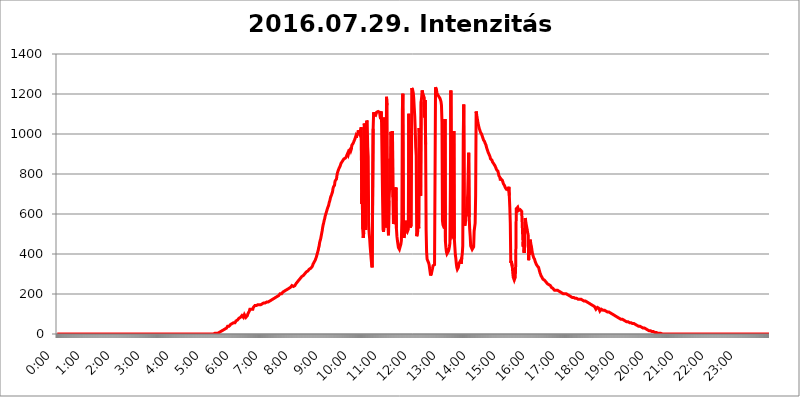
| Category | 2016.07.29. Intenzitás [W/m^2] |
|---|---|
| 0.0 | 0 |
| 0.0006944444444444445 | 0 |
| 0.001388888888888889 | 0 |
| 0.0020833333333333333 | 0 |
| 0.002777777777777778 | 0 |
| 0.003472222222222222 | 0 |
| 0.004166666666666667 | 0 |
| 0.004861111111111111 | 0 |
| 0.005555555555555556 | 0 |
| 0.0062499999999999995 | 0 |
| 0.006944444444444444 | 0 |
| 0.007638888888888889 | 0 |
| 0.008333333333333333 | 0 |
| 0.009027777777777779 | 0 |
| 0.009722222222222222 | 0 |
| 0.010416666666666666 | 0 |
| 0.011111111111111112 | 0 |
| 0.011805555555555555 | 0 |
| 0.012499999999999999 | 0 |
| 0.013194444444444444 | 0 |
| 0.013888888888888888 | 0 |
| 0.014583333333333332 | 0 |
| 0.015277777777777777 | 0 |
| 0.015972222222222224 | 0 |
| 0.016666666666666666 | 0 |
| 0.017361111111111112 | 0 |
| 0.018055555555555557 | 0 |
| 0.01875 | 0 |
| 0.019444444444444445 | 0 |
| 0.02013888888888889 | 0 |
| 0.020833333333333332 | 0 |
| 0.02152777777777778 | 0 |
| 0.022222222222222223 | 0 |
| 0.02291666666666667 | 0 |
| 0.02361111111111111 | 0 |
| 0.024305555555555556 | 0 |
| 0.024999999999999998 | 0 |
| 0.025694444444444447 | 0 |
| 0.02638888888888889 | 0 |
| 0.027083333333333334 | 0 |
| 0.027777777777777776 | 0 |
| 0.02847222222222222 | 0 |
| 0.029166666666666664 | 0 |
| 0.029861111111111113 | 0 |
| 0.030555555555555555 | 0 |
| 0.03125 | 0 |
| 0.03194444444444445 | 0 |
| 0.03263888888888889 | 0 |
| 0.03333333333333333 | 0 |
| 0.034027777777777775 | 0 |
| 0.034722222222222224 | 0 |
| 0.035416666666666666 | 0 |
| 0.036111111111111115 | 0 |
| 0.03680555555555556 | 0 |
| 0.0375 | 0 |
| 0.03819444444444444 | 0 |
| 0.03888888888888889 | 0 |
| 0.03958333333333333 | 0 |
| 0.04027777777777778 | 0 |
| 0.04097222222222222 | 0 |
| 0.041666666666666664 | 0 |
| 0.042361111111111106 | 0 |
| 0.04305555555555556 | 0 |
| 0.043750000000000004 | 0 |
| 0.044444444444444446 | 0 |
| 0.04513888888888889 | 0 |
| 0.04583333333333334 | 0 |
| 0.04652777777777778 | 0 |
| 0.04722222222222222 | 0 |
| 0.04791666666666666 | 0 |
| 0.04861111111111111 | 0 |
| 0.049305555555555554 | 0 |
| 0.049999999999999996 | 0 |
| 0.05069444444444445 | 0 |
| 0.051388888888888894 | 0 |
| 0.052083333333333336 | 0 |
| 0.05277777777777778 | 0 |
| 0.05347222222222222 | 0 |
| 0.05416666666666667 | 0 |
| 0.05486111111111111 | 0 |
| 0.05555555555555555 | 0 |
| 0.05625 | 0 |
| 0.05694444444444444 | 0 |
| 0.057638888888888885 | 0 |
| 0.05833333333333333 | 0 |
| 0.05902777777777778 | 0 |
| 0.059722222222222225 | 0 |
| 0.06041666666666667 | 0 |
| 0.061111111111111116 | 0 |
| 0.06180555555555556 | 0 |
| 0.0625 | 0 |
| 0.06319444444444444 | 0 |
| 0.06388888888888888 | 0 |
| 0.06458333333333334 | 0 |
| 0.06527777777777778 | 0 |
| 0.06597222222222222 | 0 |
| 0.06666666666666667 | 0 |
| 0.06736111111111111 | 0 |
| 0.06805555555555555 | 0 |
| 0.06874999999999999 | 0 |
| 0.06944444444444443 | 0 |
| 0.07013888888888889 | 0 |
| 0.07083333333333333 | 0 |
| 0.07152777777777779 | 0 |
| 0.07222222222222223 | 0 |
| 0.07291666666666667 | 0 |
| 0.07361111111111111 | 0 |
| 0.07430555555555556 | 0 |
| 0.075 | 0 |
| 0.07569444444444444 | 0 |
| 0.0763888888888889 | 0 |
| 0.07708333333333334 | 0 |
| 0.07777777777777778 | 0 |
| 0.07847222222222222 | 0 |
| 0.07916666666666666 | 0 |
| 0.0798611111111111 | 0 |
| 0.08055555555555556 | 0 |
| 0.08125 | 0 |
| 0.08194444444444444 | 0 |
| 0.08263888888888889 | 0 |
| 0.08333333333333333 | 0 |
| 0.08402777777777777 | 0 |
| 0.08472222222222221 | 0 |
| 0.08541666666666665 | 0 |
| 0.08611111111111112 | 0 |
| 0.08680555555555557 | 0 |
| 0.08750000000000001 | 0 |
| 0.08819444444444445 | 0 |
| 0.08888888888888889 | 0 |
| 0.08958333333333333 | 0 |
| 0.09027777777777778 | 0 |
| 0.09097222222222222 | 0 |
| 0.09166666666666667 | 0 |
| 0.09236111111111112 | 0 |
| 0.09305555555555556 | 0 |
| 0.09375 | 0 |
| 0.09444444444444444 | 0 |
| 0.09513888888888888 | 0 |
| 0.09583333333333333 | 0 |
| 0.09652777777777777 | 0 |
| 0.09722222222222222 | 0 |
| 0.09791666666666667 | 0 |
| 0.09861111111111111 | 0 |
| 0.09930555555555555 | 0 |
| 0.09999999999999999 | 0 |
| 0.10069444444444443 | 0 |
| 0.1013888888888889 | 0 |
| 0.10208333333333335 | 0 |
| 0.10277777777777779 | 0 |
| 0.10347222222222223 | 0 |
| 0.10416666666666667 | 0 |
| 0.10486111111111111 | 0 |
| 0.10555555555555556 | 0 |
| 0.10625 | 0 |
| 0.10694444444444444 | 0 |
| 0.1076388888888889 | 0 |
| 0.10833333333333334 | 0 |
| 0.10902777777777778 | 0 |
| 0.10972222222222222 | 0 |
| 0.1111111111111111 | 0 |
| 0.11180555555555556 | 0 |
| 0.11180555555555556 | 0 |
| 0.1125 | 0 |
| 0.11319444444444444 | 0 |
| 0.11388888888888889 | 0 |
| 0.11458333333333333 | 0 |
| 0.11527777777777777 | 0 |
| 0.11597222222222221 | 0 |
| 0.11666666666666665 | 0 |
| 0.1173611111111111 | 0 |
| 0.11805555555555557 | 0 |
| 0.11944444444444445 | 0 |
| 0.12013888888888889 | 0 |
| 0.12083333333333333 | 0 |
| 0.12152777777777778 | 0 |
| 0.12222222222222223 | 0 |
| 0.12291666666666667 | 0 |
| 0.12291666666666667 | 0 |
| 0.12361111111111112 | 0 |
| 0.12430555555555556 | 0 |
| 0.125 | 0 |
| 0.12569444444444444 | 0 |
| 0.12638888888888888 | 0 |
| 0.12708333333333333 | 0 |
| 0.16875 | 0 |
| 0.12847222222222224 | 0 |
| 0.12916666666666668 | 0 |
| 0.12986111111111112 | 0 |
| 0.13055555555555556 | 0 |
| 0.13125 | 0 |
| 0.13194444444444445 | 0 |
| 0.1326388888888889 | 0 |
| 0.13333333333333333 | 0 |
| 0.13402777777777777 | 0 |
| 0.13402777777777777 | 0 |
| 0.13472222222222222 | 0 |
| 0.13541666666666666 | 0 |
| 0.1361111111111111 | 0 |
| 0.13749999999999998 | 0 |
| 0.13819444444444443 | 0 |
| 0.1388888888888889 | 0 |
| 0.13958333333333334 | 0 |
| 0.14027777777777778 | 0 |
| 0.14097222222222222 | 0 |
| 0.14166666666666666 | 0 |
| 0.1423611111111111 | 0 |
| 0.14305555555555557 | 0 |
| 0.14375000000000002 | 0 |
| 0.14444444444444446 | 0 |
| 0.1451388888888889 | 0 |
| 0.1451388888888889 | 0 |
| 0.14652777777777778 | 0 |
| 0.14722222222222223 | 0 |
| 0.14791666666666667 | 0 |
| 0.1486111111111111 | 0 |
| 0.14930555555555555 | 0 |
| 0.15 | 0 |
| 0.15069444444444444 | 0 |
| 0.15138888888888888 | 0 |
| 0.15208333333333332 | 0 |
| 0.15277777777777776 | 0 |
| 0.15347222222222223 | 0 |
| 0.15416666666666667 | 0 |
| 0.15486111111111112 | 0 |
| 0.15555555555555556 | 0 |
| 0.15625 | 0 |
| 0.15694444444444444 | 0 |
| 0.15763888888888888 | 0 |
| 0.15833333333333333 | 0 |
| 0.15902777777777777 | 0 |
| 0.15972222222222224 | 0 |
| 0.16041666666666668 | 0 |
| 0.16111111111111112 | 0 |
| 0.16180555555555556 | 0 |
| 0.1625 | 0 |
| 0.16319444444444445 | 0 |
| 0.1638888888888889 | 0 |
| 0.16458333333333333 | 0 |
| 0.16527777777777777 | 0 |
| 0.16597222222222222 | 0 |
| 0.16666666666666666 | 0 |
| 0.1673611111111111 | 0 |
| 0.16805555555555554 | 0 |
| 0.16874999999999998 | 0 |
| 0.16944444444444443 | 0 |
| 0.17013888888888887 | 0 |
| 0.1708333333333333 | 0 |
| 0.17152777777777775 | 0 |
| 0.17222222222222225 | 0 |
| 0.1729166666666667 | 0 |
| 0.17361111111111113 | 0 |
| 0.17430555555555557 | 0 |
| 0.17500000000000002 | 0 |
| 0.17569444444444446 | 0 |
| 0.1763888888888889 | 0 |
| 0.17708333333333334 | 0 |
| 0.17777777777777778 | 0 |
| 0.17847222222222223 | 0 |
| 0.17916666666666667 | 0 |
| 0.1798611111111111 | 0 |
| 0.18055555555555555 | 0 |
| 0.18125 | 0 |
| 0.18194444444444444 | 0 |
| 0.1826388888888889 | 0 |
| 0.18333333333333335 | 0 |
| 0.1840277777777778 | 0 |
| 0.18472222222222223 | 0 |
| 0.18541666666666667 | 0 |
| 0.18611111111111112 | 0 |
| 0.18680555555555556 | 0 |
| 0.1875 | 0 |
| 0.18819444444444444 | 0 |
| 0.18888888888888888 | 0 |
| 0.18958333333333333 | 0 |
| 0.19027777777777777 | 0 |
| 0.1909722222222222 | 0 |
| 0.19166666666666665 | 0 |
| 0.19236111111111112 | 0 |
| 0.19305555555555554 | 0 |
| 0.19375 | 0 |
| 0.19444444444444445 | 0 |
| 0.1951388888888889 | 0 |
| 0.19583333333333333 | 0 |
| 0.19652777777777777 | 0 |
| 0.19722222222222222 | 0 |
| 0.19791666666666666 | 0 |
| 0.1986111111111111 | 0 |
| 0.19930555555555554 | 0 |
| 0.19999999999999998 | 0 |
| 0.20069444444444443 | 0 |
| 0.20138888888888887 | 0 |
| 0.2020833333333333 | 0 |
| 0.2027777777777778 | 0 |
| 0.2034722222222222 | 0 |
| 0.2041666666666667 | 0 |
| 0.20486111111111113 | 0 |
| 0.20555555555555557 | 0 |
| 0.20625000000000002 | 0 |
| 0.20694444444444446 | 0 |
| 0.2076388888888889 | 0 |
| 0.20833333333333334 | 0 |
| 0.20902777777777778 | 0 |
| 0.20972222222222223 | 0 |
| 0.21041666666666667 | 0 |
| 0.2111111111111111 | 0 |
| 0.21180555555555555 | 0 |
| 0.2125 | 0 |
| 0.21319444444444444 | 0 |
| 0.2138888888888889 | 0 |
| 0.21458333333333335 | 0 |
| 0.2152777777777778 | 0 |
| 0.21597222222222223 | 0 |
| 0.21666666666666667 | 0 |
| 0.21736111111111112 | 0 |
| 0.21805555555555556 | 0 |
| 0.21875 | 0 |
| 0.21944444444444444 | 0 |
| 0.22013888888888888 | 3.525 |
| 0.22083333333333333 | 3.525 |
| 0.22152777777777777 | 3.525 |
| 0.2222222222222222 | 3.525 |
| 0.22291666666666665 | 3.525 |
| 0.2236111111111111 | 3.525 |
| 0.22430555555555556 | 3.525 |
| 0.225 | 3.525 |
| 0.22569444444444445 | 3.525 |
| 0.2263888888888889 | 7.887 |
| 0.22708333333333333 | 7.887 |
| 0.22777777777777777 | 7.887 |
| 0.22847222222222222 | 7.887 |
| 0.22916666666666666 | 12.257 |
| 0.2298611111111111 | 12.257 |
| 0.23055555555555554 | 12.257 |
| 0.23124999999999998 | 16.636 |
| 0.23194444444444443 | 16.636 |
| 0.23263888888888887 | 21.024 |
| 0.2333333333333333 | 21.024 |
| 0.2340277777777778 | 25.419 |
| 0.2347222222222222 | 25.419 |
| 0.2354166666666667 | 25.419 |
| 0.23611111111111113 | 29.823 |
| 0.23680555555555557 | 29.823 |
| 0.23750000000000002 | 29.823 |
| 0.23819444444444446 | 34.234 |
| 0.2388888888888889 | 38.653 |
| 0.23958333333333334 | 38.653 |
| 0.24027777777777778 | 38.653 |
| 0.24097222222222223 | 38.653 |
| 0.24166666666666667 | 43.079 |
| 0.2423611111111111 | 43.079 |
| 0.24305555555555555 | 47.511 |
| 0.24375 | 47.511 |
| 0.24444444444444446 | 47.511 |
| 0.24513888888888888 | 51.951 |
| 0.24583333333333335 | 51.951 |
| 0.2465277777777778 | 51.951 |
| 0.24722222222222223 | 56.398 |
| 0.24791666666666667 | 56.398 |
| 0.24861111111111112 | 56.398 |
| 0.24930555555555556 | 56.398 |
| 0.25 | 60.85 |
| 0.25069444444444444 | 65.31 |
| 0.2513888888888889 | 65.31 |
| 0.2520833333333333 | 65.31 |
| 0.25277777777777777 | 69.775 |
| 0.2534722222222222 | 74.246 |
| 0.25416666666666665 | 74.246 |
| 0.2548611111111111 | 78.722 |
| 0.2555555555555556 | 78.722 |
| 0.25625000000000003 | 83.205 |
| 0.2569444444444445 | 83.205 |
| 0.2576388888888889 | 87.692 |
| 0.25833333333333336 | 87.692 |
| 0.2590277777777778 | 92.184 |
| 0.25972222222222224 | 92.184 |
| 0.2604166666666667 | 92.184 |
| 0.2611111111111111 | 83.205 |
| 0.26180555555555557 | 87.692 |
| 0.2625 | 96.682 |
| 0.26319444444444445 | 96.682 |
| 0.2638888888888889 | 92.184 |
| 0.26458333333333334 | 83.205 |
| 0.2652777777777778 | 78.722 |
| 0.2659722222222222 | 87.692 |
| 0.26666666666666666 | 92.184 |
| 0.2673611111111111 | 101.184 |
| 0.26805555555555555 | 105.69 |
| 0.26875 | 105.69 |
| 0.26944444444444443 | 114.716 |
| 0.2701388888888889 | 123.758 |
| 0.2708333333333333 | 123.758 |
| 0.27152777777777776 | 128.284 |
| 0.2722222222222222 | 123.758 |
| 0.27291666666666664 | 123.758 |
| 0.2736111111111111 | 123.758 |
| 0.2743055555555555 | 123.758 |
| 0.27499999999999997 | 132.814 |
| 0.27569444444444446 | 137.347 |
| 0.27638888888888885 | 137.347 |
| 0.27708333333333335 | 141.884 |
| 0.2777777777777778 | 141.884 |
| 0.27847222222222223 | 141.884 |
| 0.2791666666666667 | 141.884 |
| 0.2798611111111111 | 141.884 |
| 0.28055555555555556 | 146.423 |
| 0.28125 | 146.423 |
| 0.28194444444444444 | 146.423 |
| 0.2826388888888889 | 146.423 |
| 0.2833333333333333 | 146.423 |
| 0.28402777777777777 | 146.423 |
| 0.2847222222222222 | 146.423 |
| 0.28541666666666665 | 146.423 |
| 0.28611111111111115 | 146.423 |
| 0.28680555555555554 | 146.423 |
| 0.28750000000000003 | 150.964 |
| 0.2881944444444445 | 150.964 |
| 0.2888888888888889 | 150.964 |
| 0.28958333333333336 | 155.509 |
| 0.2902777777777778 | 155.509 |
| 0.29097222222222224 | 155.509 |
| 0.2916666666666667 | 155.509 |
| 0.2923611111111111 | 155.509 |
| 0.29305555555555557 | 155.509 |
| 0.29375 | 160.056 |
| 0.29444444444444445 | 160.056 |
| 0.2951388888888889 | 160.056 |
| 0.29583333333333334 | 160.056 |
| 0.2965277777777778 | 164.605 |
| 0.2972222222222222 | 164.605 |
| 0.29791666666666666 | 164.605 |
| 0.2986111111111111 | 169.156 |
| 0.29930555555555555 | 169.156 |
| 0.3 | 169.156 |
| 0.30069444444444443 | 169.156 |
| 0.3013888888888889 | 173.709 |
| 0.3020833333333333 | 173.709 |
| 0.30277777777777776 | 173.709 |
| 0.3034722222222222 | 178.264 |
| 0.30416666666666664 | 178.264 |
| 0.3048611111111111 | 178.264 |
| 0.3055555555555555 | 182.82 |
| 0.30624999999999997 | 182.82 |
| 0.3069444444444444 | 182.82 |
| 0.3076388888888889 | 182.82 |
| 0.30833333333333335 | 187.378 |
| 0.3090277777777778 | 191.937 |
| 0.30972222222222223 | 191.937 |
| 0.3104166666666667 | 191.937 |
| 0.3111111111111111 | 196.497 |
| 0.31180555555555556 | 196.497 |
| 0.3125 | 201.058 |
| 0.31319444444444444 | 201.058 |
| 0.3138888888888889 | 201.058 |
| 0.3145833333333333 | 201.058 |
| 0.31527777777777777 | 205.62 |
| 0.3159722222222222 | 205.62 |
| 0.31666666666666665 | 210.182 |
| 0.31736111111111115 | 210.182 |
| 0.31805555555555554 | 210.182 |
| 0.31875000000000003 | 214.746 |
| 0.3194444444444445 | 214.746 |
| 0.3201388888888889 | 219.309 |
| 0.32083333333333336 | 219.309 |
| 0.3215277777777778 | 219.309 |
| 0.32222222222222224 | 219.309 |
| 0.3229166666666667 | 223.873 |
| 0.3236111111111111 | 223.873 |
| 0.32430555555555557 | 228.436 |
| 0.325 | 228.436 |
| 0.32569444444444445 | 228.436 |
| 0.3263888888888889 | 233 |
| 0.32708333333333334 | 233 |
| 0.3277777777777778 | 237.564 |
| 0.3284722222222222 | 237.564 |
| 0.32916666666666666 | 242.127 |
| 0.3298611111111111 | 242.127 |
| 0.33055555555555555 | 242.127 |
| 0.33125 | 237.564 |
| 0.33194444444444443 | 242.127 |
| 0.3326388888888889 | 242.127 |
| 0.3333333333333333 | 242.127 |
| 0.3340277777777778 | 246.689 |
| 0.3347222222222222 | 251.251 |
| 0.3354166666666667 | 255.813 |
| 0.3361111111111111 | 255.813 |
| 0.3368055555555556 | 260.373 |
| 0.33749999999999997 | 260.373 |
| 0.33819444444444446 | 264.932 |
| 0.33888888888888885 | 269.49 |
| 0.33958333333333335 | 269.49 |
| 0.34027777777777773 | 274.047 |
| 0.34097222222222223 | 278.603 |
| 0.3416666666666666 | 278.603 |
| 0.3423611111111111 | 283.156 |
| 0.3430555555555555 | 287.709 |
| 0.34375 | 287.709 |
| 0.3444444444444445 | 287.709 |
| 0.3451388888888889 | 292.259 |
| 0.3458333333333334 | 296.808 |
| 0.34652777777777777 | 296.808 |
| 0.34722222222222227 | 301.354 |
| 0.34791666666666665 | 305.898 |
| 0.34861111111111115 | 305.898 |
| 0.34930555555555554 | 310.44 |
| 0.35000000000000003 | 310.44 |
| 0.3506944444444444 | 314.98 |
| 0.3513888888888889 | 314.98 |
| 0.3520833333333333 | 319.517 |
| 0.3527777777777778 | 319.517 |
| 0.3534722222222222 | 324.052 |
| 0.3541666666666667 | 324.052 |
| 0.3548611111111111 | 324.052 |
| 0.35555555555555557 | 328.584 |
| 0.35625 | 333.113 |
| 0.35694444444444445 | 333.113 |
| 0.3576388888888889 | 337.639 |
| 0.35833333333333334 | 342.162 |
| 0.3590277777777778 | 351.198 |
| 0.3597222222222222 | 355.712 |
| 0.36041666666666666 | 360.221 |
| 0.3611111111111111 | 364.728 |
| 0.36180555555555555 | 369.23 |
| 0.3625 | 373.729 |
| 0.36319444444444443 | 382.715 |
| 0.3638888888888889 | 387.202 |
| 0.3645833333333333 | 400.638 |
| 0.3652777777777778 | 409.574 |
| 0.3659722222222222 | 418.492 |
| 0.3666666666666667 | 431.833 |
| 0.3673611111111111 | 440.702 |
| 0.3680555555555556 | 458.38 |
| 0.36874999999999997 | 467.187 |
| 0.36944444444444446 | 475.972 |
| 0.37013888888888885 | 489.108 |
| 0.37083333333333335 | 502.192 |
| 0.37152777777777773 | 515.223 |
| 0.37222222222222223 | 532.513 |
| 0.3729166666666666 | 545.416 |
| 0.3736111111111111 | 553.986 |
| 0.3743055555555555 | 566.793 |
| 0.375 | 575.299 |
| 0.3756944444444445 | 588.009 |
| 0.3763888888888889 | 596.45 |
| 0.3770833333333334 | 604.864 |
| 0.37777777777777777 | 613.252 |
| 0.37847222222222227 | 621.613 |
| 0.37916666666666665 | 629.948 |
| 0.37986111111111115 | 634.105 |
| 0.38055555555555554 | 642.4 |
| 0.38125000000000003 | 654.791 |
| 0.3819444444444444 | 663.019 |
| 0.3826388888888889 | 671.22 |
| 0.3833333333333333 | 683.473 |
| 0.3840277777777778 | 687.544 |
| 0.3847222222222222 | 695.666 |
| 0.3854166666666667 | 703.762 |
| 0.3861111111111111 | 711.832 |
| 0.38680555555555557 | 727.896 |
| 0.3875 | 735.89 |
| 0.38819444444444445 | 739.877 |
| 0.3888888888888889 | 743.859 |
| 0.38958333333333334 | 763.674 |
| 0.3902777777777778 | 759.723 |
| 0.3909722222222222 | 759.723 |
| 0.39166666666666666 | 775.492 |
| 0.3923611111111111 | 795.074 |
| 0.39305555555555555 | 806.757 |
| 0.39375 | 814.519 |
| 0.39444444444444443 | 822.26 |
| 0.3951388888888889 | 822.26 |
| 0.3958333333333333 | 826.123 |
| 0.3965277777777778 | 837.682 |
| 0.3972222222222222 | 845.365 |
| 0.3979166666666667 | 853.029 |
| 0.3986111111111111 | 856.855 |
| 0.3993055555555556 | 860.676 |
| 0.39999999999999997 | 864.493 |
| 0.40069444444444446 | 868.305 |
| 0.40138888888888885 | 872.114 |
| 0.40208333333333335 | 875.918 |
| 0.40277777777777773 | 875.918 |
| 0.40347222222222223 | 879.719 |
| 0.4041666666666666 | 879.719 |
| 0.4048611111111111 | 883.516 |
| 0.4055555555555555 | 887.309 |
| 0.40625 | 894.885 |
| 0.4069444444444445 | 898.668 |
| 0.4076388888888889 | 906.223 |
| 0.4083333333333334 | 898.668 |
| 0.40902777777777777 | 902.447 |
| 0.40972222222222227 | 917.534 |
| 0.41041666666666665 | 921.298 |
| 0.41111111111111115 | 925.06 |
| 0.41180555555555554 | 917.534 |
| 0.41250000000000003 | 925.06 |
| 0.4131944444444444 | 943.832 |
| 0.4138888888888889 | 940.082 |
| 0.4145833333333333 | 943.832 |
| 0.4152777777777778 | 955.071 |
| 0.4159722222222222 | 962.555 |
| 0.4166666666666667 | 962.555 |
| 0.4173611111111111 | 973.772 |
| 0.41805555555555557 | 973.772 |
| 0.41875 | 988.714 |
| 0.41944444444444445 | 981.244 |
| 0.4201388888888889 | 996.182 |
| 0.42083333333333334 | 996.182 |
| 0.4215277777777778 | 1003.65 |
| 0.4222222222222222 | 1018.587 |
| 0.42291666666666666 | 1018.587 |
| 0.4236111111111111 | 1003.65 |
| 0.42430555555555555 | 1011.118 |
| 0.425 | 1014.852 |
| 0.42569444444444443 | 1022.323 |
| 0.4263888888888889 | 1033.537 |
| 0.4270833333333333 | 650.667 |
| 0.4277777777777778 | 703.762 |
| 0.4284722222222222 | 523.88 |
| 0.4291666666666667 | 480.356 |
| 0.4298611111111111 | 506.542 |
| 0.4305555555555556 | 1052.255 |
| 0.43124999999999997 | 1056.004 |
| 0.43194444444444446 | 1018.587 |
| 0.43263888888888885 | 519.555 |
| 0.43333333333333335 | 1029.798 |
| 0.43402777777777773 | 1067.267 |
| 0.43472222222222223 | 1059.756 |
| 0.4354166666666666 | 936.33 |
| 0.4361111111111111 | 887.309 |
| 0.4368055555555555 | 545.416 |
| 0.4375 | 502.192 |
| 0.4381944444444445 | 475.972 |
| 0.4388888888888889 | 436.27 |
| 0.4395833333333334 | 405.108 |
| 0.44027777777777777 | 373.729 |
| 0.44097222222222227 | 346.682 |
| 0.44166666666666665 | 333.113 |
| 0.44236111111111115 | 333.113 |
| 0.44305555555555554 | 1026.06 |
| 0.44375000000000003 | 1108.816 |
| 0.4444444444444444 | 1097.437 |
| 0.4451388888888889 | 1097.437 |
| 0.4458333333333333 | 1097.437 |
| 0.4465277777777778 | 1093.653 |
| 0.4472222222222222 | 1097.437 |
| 0.4479166666666667 | 1108.816 |
| 0.4486111111111111 | 1112.618 |
| 0.44930555555555557 | 1112.618 |
| 0.45 | 1112.618 |
| 0.45069444444444445 | 1108.816 |
| 0.4513888888888889 | 1108.816 |
| 0.45208333333333334 | 1108.816 |
| 0.4527777777777778 | 1089.873 |
| 0.4534722222222222 | 1074.789 |
| 0.45416666666666666 | 1112.618 |
| 0.4548611111111111 | 1059.756 |
| 0.45555555555555555 | 1059.756 |
| 0.45625 | 683.473 |
| 0.45694444444444443 | 523.88 |
| 0.4576388888888889 | 510.885 |
| 0.4583333333333333 | 558.261 |
| 0.4590277777777778 | 1082.324 |
| 0.4597222222222222 | 814.519 |
| 0.4604166666666667 | 532.513 |
| 0.4611111111111111 | 558.261 |
| 0.4618055555555556 | 1186.03 |
| 0.46249999999999997 | 1143.232 |
| 0.46319444444444446 | 654.791 |
| 0.46388888888888885 | 541.121 |
| 0.46458333333333335 | 493.475 |
| 0.46527777777777773 | 667.123 |
| 0.46597222222222223 | 719.877 |
| 0.4666666666666666 | 875.918 |
| 0.4673611111111111 | 719.877 |
| 0.4680555555555555 | 1011.118 |
| 0.46875 | 992.448 |
| 0.4694444444444445 | 958.814 |
| 0.4701388888888889 | 1014.852 |
| 0.4708333333333334 | 683.473 |
| 0.47152777777777777 | 549.704 |
| 0.47222222222222227 | 549.704 |
| 0.47291666666666665 | 575.299 |
| 0.47361111111111115 | 731.896 |
| 0.47430555555555554 | 617.436 |
| 0.47500000000000003 | 731.896 |
| 0.4756944444444444 | 528.2 |
| 0.4763888888888889 | 489.108 |
| 0.4770833333333333 | 467.187 |
| 0.4777777777777778 | 449.551 |
| 0.4784722222222222 | 431.833 |
| 0.4791666666666667 | 427.39 |
| 0.4798611111111111 | 422.943 |
| 0.48055555555555557 | 422.943 |
| 0.48125 | 440.702 |
| 0.48194444444444445 | 449.551 |
| 0.4826388888888889 | 467.187 |
| 0.48333333333333334 | 566.793 |
| 0.4840277777777778 | 1116.426 |
| 0.4847222222222222 | 1201.843 |
| 0.48541666666666666 | 566.793 |
| 0.4861111111111111 | 480.356 |
| 0.48680555555555555 | 480.356 |
| 0.4875 | 506.542 |
| 0.48819444444444443 | 566.793 |
| 0.4888888888888889 | 545.416 |
| 0.4895833333333333 | 519.555 |
| 0.4902777777777778 | 519.555 |
| 0.4909722222222222 | 510.885 |
| 0.4916666666666667 | 506.542 |
| 0.4923611111111111 | 523.88 |
| 0.4930555555555556 | 1101.226 |
| 0.49374999999999997 | 592.233 |
| 0.49444444444444446 | 1026.06 |
| 0.49513888888888885 | 532.513 |
| 0.49583333333333335 | 532.513 |
| 0.49652777777777773 | 545.416 |
| 0.49722222222222223 | 1229.899 |
| 0.4979166666666666 | 1229.899 |
| 0.4986111111111111 | 1217.812 |
| 0.4993055555555555 | 1205.82 |
| 0.5 | 1178.177 |
| 0.5006944444444444 | 1131.708 |
| 0.5013888888888889 | 1089.873 |
| 0.5020833333333333 | 1022.323 |
| 0.5027777777777778 | 932.576 |
| 0.5034722222222222 | 891.099 |
| 0.5041666666666667 | 489.108 |
| 0.5048611111111111 | 484.735 |
| 0.5055555555555555 | 510.885 |
| 0.50625 | 566.793 |
| 0.5069444444444444 | 528.2 |
| 0.5076388888888889 | 1029.798 |
| 0.5083333333333333 | 981.244 |
| 0.5090277777777777 | 943.832 |
| 0.5097222222222222 | 691.608 |
| 0.5104166666666666 | 1162.571 |
| 0.5111111111111112 | 1186.03 |
| 0.5118055555555555 | 1217.812 |
| 0.5125000000000001 | 1205.82 |
| 0.5131944444444444 | 1197.876 |
| 0.513888888888889 | 1189.969 |
| 0.5145833333333333 | 1182.099 |
| 0.5152777777777778 | 1082.324 |
| 0.5159722222222222 | 1170.358 |
| 0.5166666666666667 | 947.58 |
| 0.517361111111111 | 519.555 |
| 0.5180555555555556 | 409.574 |
| 0.5187499999999999 | 373.729 |
| 0.5194444444444445 | 378.224 |
| 0.5201388888888888 | 369.23 |
| 0.5208333333333334 | 355.712 |
| 0.5215277777777778 | 346.682 |
| 0.5222222222222223 | 328.584 |
| 0.5229166666666667 | 310.44 |
| 0.5236111111111111 | 292.259 |
| 0.5243055555555556 | 296.808 |
| 0.525 | 305.898 |
| 0.5256944444444445 | 310.44 |
| 0.5263888888888889 | 328.584 |
| 0.5270833333333333 | 342.162 |
| 0.5277777777777778 | 346.682 |
| 0.5284722222222222 | 346.682 |
| 0.5291666666666667 | 346.682 |
| 0.5298611111111111 | 346.682 |
| 0.5305555555555556 | 1233.951 |
| 0.53125 | 1229.899 |
| 0.5319444444444444 | 1217.812 |
| 0.5326388888888889 | 1205.82 |
| 0.5333333333333333 | 1197.876 |
| 0.5340277777777778 | 1193.918 |
| 0.5347222222222222 | 1189.969 |
| 0.5354166666666667 | 1189.969 |
| 0.5361111111111111 | 1186.03 |
| 0.5368055555555555 | 1178.177 |
| 0.5375 | 1178.177 |
| 0.5381944444444444 | 1162.571 |
| 0.5388888888888889 | 1143.232 |
| 0.5395833333333333 | 1059.756 |
| 0.5402777777777777 | 566.793 |
| 0.5409722222222222 | 545.416 |
| 0.5416666666666666 | 541.121 |
| 0.5423611111111112 | 545.416 |
| 0.5430555555555555 | 528.2 |
| 0.5437500000000001 | 1074.789 |
| 0.5444444444444444 | 462.786 |
| 0.545138888888889 | 431.833 |
| 0.5458333333333333 | 409.574 |
| 0.5465277777777778 | 400.638 |
| 0.5472222222222222 | 396.164 |
| 0.5479166666666667 | 400.638 |
| 0.548611111111111 | 414.035 |
| 0.5493055555555556 | 422.943 |
| 0.5499999999999999 | 436.27 |
| 0.5506944444444445 | 453.968 |
| 0.5513888888888888 | 731.896 |
| 0.5520833333333334 | 1217.812 |
| 0.5527777777777778 | 759.723 |
| 0.5534722222222223 | 506.542 |
| 0.5541666666666667 | 489.108 |
| 0.5548611111111111 | 493.475 |
| 0.5555555555555556 | 497.836 |
| 0.55625 | 1014.852 |
| 0.5569444444444445 | 475.972 |
| 0.5576388888888889 | 436.27 |
| 0.5583333333333333 | 396.164 |
| 0.5590277777777778 | 378.224 |
| 0.5597222222222222 | 351.198 |
| 0.5604166666666667 | 333.113 |
| 0.5611111111111111 | 324.052 |
| 0.5618055555555556 | 324.052 |
| 0.5625 | 333.113 |
| 0.5631944444444444 | 346.682 |
| 0.5638888888888889 | 355.712 |
| 0.5645833333333333 | 360.221 |
| 0.5652777777777778 | 364.728 |
| 0.5659722222222222 | 364.728 |
| 0.5666666666666667 | 351.198 |
| 0.5673611111111111 | 382.715 |
| 0.5680555555555555 | 400.638 |
| 0.56875 | 440.702 |
| 0.5694444444444444 | 992.448 |
| 0.5701388888888889 | 1147.086 |
| 0.5708333333333333 | 596.45 |
| 0.5715277777777777 | 541.121 |
| 0.5722222222222222 | 553.986 |
| 0.5729166666666666 | 566.793 |
| 0.5736111111111112 | 629.948 |
| 0.5743055555555555 | 592.233 |
| 0.5750000000000001 | 650.667 |
| 0.5756944444444444 | 703.762 |
| 0.576388888888889 | 703.762 |
| 0.5770833333333333 | 906.223 |
| 0.5777777777777778 | 583.779 |
| 0.5784722222222222 | 523.88 |
| 0.5791666666666667 | 489.108 |
| 0.579861111111111 | 440.702 |
| 0.5805555555555556 | 436.27 |
| 0.5812499999999999 | 436.27 |
| 0.5819444444444445 | 422.943 |
| 0.5826388888888888 | 418.492 |
| 0.5833333333333334 | 418.492 |
| 0.5840277777777778 | 436.27 |
| 0.5847222222222223 | 515.223 |
| 0.5854166666666667 | 515.223 |
| 0.5861111111111111 | 553.986 |
| 0.5868055555555556 | 691.608 |
| 0.5875 | 1112.618 |
| 0.5881944444444445 | 1097.437 |
| 0.5888888888888889 | 1082.324 |
| 0.5895833333333333 | 1067.267 |
| 0.5902777777777778 | 1052.255 |
| 0.5909722222222222 | 1041.019 |
| 0.5916666666666667 | 1029.798 |
| 0.5923611111111111 | 1022.323 |
| 0.5930555555555556 | 1014.852 |
| 0.59375 | 1007.383 |
| 0.5944444444444444 | 1003.65 |
| 0.5951388888888889 | 999.916 |
| 0.5958333333333333 | 992.448 |
| 0.5965277777777778 | 984.98 |
| 0.5972222222222222 | 977.508 |
| 0.5979166666666667 | 970.034 |
| 0.5986111111111111 | 966.295 |
| 0.5993055555555555 | 962.555 |
| 0.6 | 955.071 |
| 0.6006944444444444 | 951.327 |
| 0.6013888888888889 | 943.832 |
| 0.6020833333333333 | 932.576 |
| 0.6027777777777777 | 925.06 |
| 0.6034722222222222 | 917.534 |
| 0.6041666666666666 | 909.996 |
| 0.6048611111111112 | 906.223 |
| 0.6055555555555555 | 898.668 |
| 0.6062500000000001 | 894.885 |
| 0.6069444444444444 | 887.309 |
| 0.607638888888889 | 875.918 |
| 0.6083333333333333 | 872.114 |
| 0.6090277777777778 | 872.114 |
| 0.6097222222222222 | 868.305 |
| 0.6104166666666667 | 860.676 |
| 0.611111111111111 | 856.855 |
| 0.6118055555555556 | 856.855 |
| 0.6124999999999999 | 849.199 |
| 0.6131944444444445 | 845.365 |
| 0.6138888888888888 | 841.526 |
| 0.6145833333333334 | 837.682 |
| 0.6152777777777778 | 829.981 |
| 0.6159722222222223 | 822.26 |
| 0.6166666666666667 | 822.26 |
| 0.6173611111111111 | 822.26 |
| 0.6180555555555556 | 814.519 |
| 0.61875 | 810.641 |
| 0.6194444444444445 | 791.169 |
| 0.6201388888888889 | 787.258 |
| 0.6208333333333333 | 783.342 |
| 0.6215277777777778 | 767.62 |
| 0.6222222222222222 | 775.492 |
| 0.6229166666666667 | 779.42 |
| 0.6236111111111111 | 771.559 |
| 0.6243055555555556 | 767.62 |
| 0.625 | 759.723 |
| 0.6256944444444444 | 751.803 |
| 0.6263888888888889 | 747.834 |
| 0.6270833333333333 | 743.859 |
| 0.6277777777777778 | 739.877 |
| 0.6284722222222222 | 731.896 |
| 0.6291666666666667 | 727.896 |
| 0.6298611111111111 | 723.889 |
| 0.6305555555555555 | 723.889 |
| 0.63125 | 727.896 |
| 0.6319444444444444 | 723.889 |
| 0.6326388888888889 | 715.858 |
| 0.6333333333333333 | 735.89 |
| 0.6340277777777777 | 691.608 |
| 0.6347222222222222 | 634.105 |
| 0.6354166666666666 | 553.986 |
| 0.6361111111111112 | 355.712 |
| 0.6368055555555555 | 364.728 |
| 0.6375000000000001 | 360.221 |
| 0.6381944444444444 | 337.639 |
| 0.638888888888889 | 305.898 |
| 0.6395833333333333 | 283.156 |
| 0.6402777777777778 | 278.603 |
| 0.6409722222222222 | 269.49 |
| 0.6416666666666667 | 269.49 |
| 0.642361111111111 | 283.156 |
| 0.6430555555555556 | 351.198 |
| 0.6437499999999999 | 625.784 |
| 0.6444444444444445 | 625.784 |
| 0.6451388888888888 | 629.948 |
| 0.6458333333333334 | 634.105 |
| 0.6465277777777778 | 625.784 |
| 0.6472222222222223 | 617.436 |
| 0.6479166666666667 | 617.436 |
| 0.6486111111111111 | 621.613 |
| 0.6493055555555556 | 621.613 |
| 0.65 | 621.613 |
| 0.6506944444444445 | 617.436 |
| 0.6513888888888889 | 613.252 |
| 0.6520833333333333 | 609.062 |
| 0.6527777777777778 | 493.475 |
| 0.6534722222222222 | 436.27 |
| 0.6541666666666667 | 493.475 |
| 0.6548611111111111 | 405.108 |
| 0.6555555555555556 | 440.702 |
| 0.65625 | 579.542 |
| 0.6569444444444444 | 566.793 |
| 0.6576388888888889 | 549.704 |
| 0.6583333333333333 | 536.82 |
| 0.6590277777777778 | 523.88 |
| 0.6597222222222222 | 506.542 |
| 0.6604166666666667 | 497.836 |
| 0.6611111111111111 | 369.23 |
| 0.6618055555555555 | 449.551 |
| 0.6625 | 396.164 |
| 0.6631944444444444 | 471.582 |
| 0.6638888888888889 | 458.38 |
| 0.6645833333333333 | 445.129 |
| 0.6652777777777777 | 431.833 |
| 0.6659722222222222 | 414.035 |
| 0.6666666666666666 | 400.638 |
| 0.6673611111111111 | 391.685 |
| 0.6680555555555556 | 382.715 |
| 0.6687500000000001 | 378.224 |
| 0.6694444444444444 | 373.729 |
| 0.6701388888888888 | 364.728 |
| 0.6708333333333334 | 360.221 |
| 0.6715277777777778 | 351.198 |
| 0.6722222222222222 | 346.682 |
| 0.6729166666666666 | 342.162 |
| 0.6736111111111112 | 337.639 |
| 0.6743055555555556 | 337.639 |
| 0.6749999999999999 | 333.113 |
| 0.6756944444444444 | 324.052 |
| 0.6763888888888889 | 319.517 |
| 0.6770833333333334 | 305.898 |
| 0.6777777777777777 | 301.354 |
| 0.6784722222222223 | 292.259 |
| 0.6791666666666667 | 287.709 |
| 0.6798611111111111 | 283.156 |
| 0.6805555555555555 | 278.603 |
| 0.68125 | 274.047 |
| 0.6819444444444445 | 269.49 |
| 0.6826388888888889 | 269.49 |
| 0.6833333333333332 | 269.49 |
| 0.6840277777777778 | 269.49 |
| 0.6847222222222222 | 264.932 |
| 0.6854166666666667 | 260.373 |
| 0.686111111111111 | 260.373 |
| 0.6868055555555556 | 255.813 |
| 0.6875 | 251.251 |
| 0.6881944444444444 | 251.251 |
| 0.688888888888889 | 251.251 |
| 0.6895833333333333 | 246.689 |
| 0.6902777777777778 | 246.689 |
| 0.6909722222222222 | 242.127 |
| 0.6916666666666668 | 242.127 |
| 0.6923611111111111 | 237.564 |
| 0.6930555555555555 | 233 |
| 0.69375 | 228.436 |
| 0.6944444444444445 | 228.436 |
| 0.6951388888888889 | 228.436 |
| 0.6958333333333333 | 223.873 |
| 0.6965277777777777 | 223.873 |
| 0.6972222222222223 | 219.309 |
| 0.6979166666666666 | 219.309 |
| 0.6986111111111111 | 219.309 |
| 0.6993055555555556 | 219.309 |
| 0.7000000000000001 | 219.309 |
| 0.7006944444444444 | 219.309 |
| 0.7013888888888888 | 219.309 |
| 0.7020833333333334 | 219.309 |
| 0.7027777777777778 | 214.746 |
| 0.7034722222222222 | 214.746 |
| 0.7041666666666666 | 214.746 |
| 0.7048611111111112 | 210.182 |
| 0.7055555555555556 | 210.182 |
| 0.7062499999999999 | 210.182 |
| 0.7069444444444444 | 210.182 |
| 0.7076388888888889 | 205.62 |
| 0.7083333333333334 | 205.62 |
| 0.7090277777777777 | 205.62 |
| 0.7097222222222223 | 201.058 |
| 0.7104166666666667 | 201.058 |
| 0.7111111111111111 | 201.058 |
| 0.7118055555555555 | 201.058 |
| 0.7125 | 201.058 |
| 0.7131944444444445 | 201.058 |
| 0.7138888888888889 | 201.058 |
| 0.7145833333333332 | 201.058 |
| 0.7152777777777778 | 196.497 |
| 0.7159722222222222 | 196.497 |
| 0.7166666666666667 | 191.937 |
| 0.717361111111111 | 191.937 |
| 0.7180555555555556 | 191.937 |
| 0.71875 | 191.937 |
| 0.7194444444444444 | 191.937 |
| 0.720138888888889 | 187.378 |
| 0.7208333333333333 | 187.378 |
| 0.7215277777777778 | 187.378 |
| 0.7222222222222222 | 182.82 |
| 0.7229166666666668 | 182.82 |
| 0.7236111111111111 | 182.82 |
| 0.7243055555555555 | 182.82 |
| 0.725 | 182.82 |
| 0.7256944444444445 | 182.82 |
| 0.7263888888888889 | 178.264 |
| 0.7270833333333333 | 178.264 |
| 0.7277777777777777 | 178.264 |
| 0.7284722222222223 | 178.264 |
| 0.7291666666666666 | 173.709 |
| 0.7298611111111111 | 173.709 |
| 0.7305555555555556 | 173.709 |
| 0.7312500000000001 | 173.709 |
| 0.7319444444444444 | 173.709 |
| 0.7326388888888888 | 173.709 |
| 0.7333333333333334 | 173.709 |
| 0.7340277777777778 | 173.709 |
| 0.7347222222222222 | 173.709 |
| 0.7354166666666666 | 173.709 |
| 0.7361111111111112 | 169.156 |
| 0.7368055555555556 | 169.156 |
| 0.7374999999999999 | 169.156 |
| 0.7381944444444444 | 169.156 |
| 0.7388888888888889 | 164.605 |
| 0.7395833333333334 | 164.605 |
| 0.7402777777777777 | 164.605 |
| 0.7409722222222223 | 164.605 |
| 0.7416666666666667 | 160.056 |
| 0.7423611111111111 | 160.056 |
| 0.7430555555555555 | 160.056 |
| 0.74375 | 160.056 |
| 0.7444444444444445 | 155.509 |
| 0.7451388888888889 | 155.509 |
| 0.7458333333333332 | 155.509 |
| 0.7465277777777778 | 150.964 |
| 0.7472222222222222 | 150.964 |
| 0.7479166666666667 | 146.423 |
| 0.748611111111111 | 146.423 |
| 0.7493055555555556 | 146.423 |
| 0.75 | 141.884 |
| 0.7506944444444444 | 141.884 |
| 0.751388888888889 | 141.884 |
| 0.7520833333333333 | 141.884 |
| 0.7527777777777778 | 137.347 |
| 0.7534722222222222 | 137.347 |
| 0.7541666666666668 | 132.814 |
| 0.7548611111111111 | 132.814 |
| 0.7555555555555555 | 123.758 |
| 0.75625 | 128.284 |
| 0.7569444444444445 | 128.284 |
| 0.7576388888888889 | 132.814 |
| 0.7583333333333333 | 132.814 |
| 0.7590277777777777 | 132.814 |
| 0.7597222222222223 | 128.284 |
| 0.7604166666666666 | 123.758 |
| 0.7611111111111111 | 114.716 |
| 0.7618055555555556 | 119.235 |
| 0.7625000000000001 | 119.235 |
| 0.7631944444444444 | 123.758 |
| 0.7638888888888888 | 123.758 |
| 0.7645833333333334 | 119.235 |
| 0.7652777777777778 | 119.235 |
| 0.7659722222222222 | 119.235 |
| 0.7666666666666666 | 119.235 |
| 0.7673611111111112 | 119.235 |
| 0.7680555555555556 | 114.716 |
| 0.7687499999999999 | 114.716 |
| 0.7694444444444444 | 114.716 |
| 0.7701388888888889 | 114.716 |
| 0.7708333333333334 | 114.716 |
| 0.7715277777777777 | 110.201 |
| 0.7722222222222223 | 110.201 |
| 0.7729166666666667 | 110.201 |
| 0.7736111111111111 | 110.201 |
| 0.7743055555555555 | 110.201 |
| 0.775 | 105.69 |
| 0.7756944444444445 | 105.69 |
| 0.7763888888888889 | 105.69 |
| 0.7770833333333332 | 101.184 |
| 0.7777777777777778 | 101.184 |
| 0.7784722222222222 | 101.184 |
| 0.7791666666666667 | 101.184 |
| 0.779861111111111 | 96.682 |
| 0.7805555555555556 | 96.682 |
| 0.78125 | 92.184 |
| 0.7819444444444444 | 92.184 |
| 0.782638888888889 | 92.184 |
| 0.7833333333333333 | 92.184 |
| 0.7840277777777778 | 87.692 |
| 0.7847222222222222 | 87.692 |
| 0.7854166666666668 | 83.205 |
| 0.7861111111111111 | 83.205 |
| 0.7868055555555555 | 83.205 |
| 0.7875 | 78.722 |
| 0.7881944444444445 | 78.722 |
| 0.7888888888888889 | 78.722 |
| 0.7895833333333333 | 78.722 |
| 0.7902777777777777 | 74.246 |
| 0.7909722222222223 | 74.246 |
| 0.7916666666666666 | 74.246 |
| 0.7923611111111111 | 74.246 |
| 0.7930555555555556 | 69.775 |
| 0.7937500000000001 | 69.775 |
| 0.7944444444444444 | 69.775 |
| 0.7951388888888888 | 65.31 |
| 0.7958333333333334 | 65.31 |
| 0.7965277777777778 | 65.31 |
| 0.7972222222222222 | 65.31 |
| 0.7979166666666666 | 65.31 |
| 0.7986111111111112 | 60.85 |
| 0.7993055555555556 | 60.85 |
| 0.7999999999999999 | 60.85 |
| 0.8006944444444444 | 60.85 |
| 0.8013888888888889 | 60.85 |
| 0.8020833333333334 | 56.398 |
| 0.8027777777777777 | 56.398 |
| 0.8034722222222223 | 56.398 |
| 0.8041666666666667 | 56.398 |
| 0.8048611111111111 | 56.398 |
| 0.8055555555555555 | 56.398 |
| 0.80625 | 51.951 |
| 0.8069444444444445 | 51.951 |
| 0.8076388888888889 | 51.951 |
| 0.8083333333333332 | 51.951 |
| 0.8090277777777778 | 51.951 |
| 0.8097222222222222 | 47.511 |
| 0.8104166666666667 | 47.511 |
| 0.811111111111111 | 47.511 |
| 0.8118055555555556 | 47.511 |
| 0.8125 | 43.079 |
| 0.8131944444444444 | 43.079 |
| 0.813888888888889 | 43.079 |
| 0.8145833333333333 | 43.079 |
| 0.8152777777777778 | 38.653 |
| 0.8159722222222222 | 38.653 |
| 0.8166666666666668 | 38.653 |
| 0.8173611111111111 | 38.653 |
| 0.8180555555555555 | 38.653 |
| 0.81875 | 38.653 |
| 0.8194444444444445 | 34.234 |
| 0.8201388888888889 | 34.234 |
| 0.8208333333333333 | 34.234 |
| 0.8215277777777777 | 29.823 |
| 0.8222222222222223 | 29.823 |
| 0.8229166666666666 | 29.823 |
| 0.8236111111111111 | 29.823 |
| 0.8243055555555556 | 29.823 |
| 0.8250000000000001 | 25.419 |
| 0.8256944444444444 | 25.419 |
| 0.8263888888888888 | 25.419 |
| 0.8270833333333334 | 21.024 |
| 0.8277777777777778 | 21.024 |
| 0.8284722222222222 | 21.024 |
| 0.8291666666666666 | 21.024 |
| 0.8298611111111112 | 16.636 |
| 0.8305555555555556 | 16.636 |
| 0.8312499999999999 | 16.636 |
| 0.8319444444444444 | 16.636 |
| 0.8326388888888889 | 12.257 |
| 0.8333333333333334 | 12.257 |
| 0.8340277777777777 | 12.257 |
| 0.8347222222222223 | 12.257 |
| 0.8354166666666667 | 12.257 |
| 0.8361111111111111 | 12.257 |
| 0.8368055555555555 | 12.257 |
| 0.8375 | 12.257 |
| 0.8381944444444445 | 7.887 |
| 0.8388888888888889 | 7.887 |
| 0.8395833333333332 | 7.887 |
| 0.8402777777777778 | 7.887 |
| 0.8409722222222222 | 7.887 |
| 0.8416666666666667 | 7.887 |
| 0.842361111111111 | 3.525 |
| 0.8430555555555556 | 3.525 |
| 0.84375 | 3.525 |
| 0.8444444444444444 | 3.525 |
| 0.845138888888889 | 3.525 |
| 0.8458333333333333 | 3.525 |
| 0.8465277777777778 | 3.525 |
| 0.8472222222222222 | 3.525 |
| 0.8479166666666668 | 0 |
| 0.8486111111111111 | 0 |
| 0.8493055555555555 | 0 |
| 0.85 | 0 |
| 0.8506944444444445 | 0 |
| 0.8513888888888889 | 0 |
| 0.8520833333333333 | 0 |
| 0.8527777777777777 | 0 |
| 0.8534722222222223 | 0 |
| 0.8541666666666666 | 0 |
| 0.8548611111111111 | 0 |
| 0.8555555555555556 | 0 |
| 0.8562500000000001 | 0 |
| 0.8569444444444444 | 0 |
| 0.8576388888888888 | 0 |
| 0.8583333333333334 | 0 |
| 0.8590277777777778 | 0 |
| 0.8597222222222222 | 0 |
| 0.8604166666666666 | 0 |
| 0.8611111111111112 | 0 |
| 0.8618055555555556 | 0 |
| 0.8624999999999999 | 0 |
| 0.8631944444444444 | 0 |
| 0.8638888888888889 | 0 |
| 0.8645833333333334 | 0 |
| 0.8652777777777777 | 0 |
| 0.8659722222222223 | 0 |
| 0.8666666666666667 | 0 |
| 0.8673611111111111 | 0 |
| 0.8680555555555555 | 0 |
| 0.86875 | 0 |
| 0.8694444444444445 | 0 |
| 0.8701388888888889 | 0 |
| 0.8708333333333332 | 0 |
| 0.8715277777777778 | 0 |
| 0.8722222222222222 | 0 |
| 0.8729166666666667 | 0 |
| 0.873611111111111 | 0 |
| 0.8743055555555556 | 0 |
| 0.875 | 0 |
| 0.8756944444444444 | 0 |
| 0.876388888888889 | 0 |
| 0.8770833333333333 | 0 |
| 0.8777777777777778 | 0 |
| 0.8784722222222222 | 0 |
| 0.8791666666666668 | 0 |
| 0.8798611111111111 | 0 |
| 0.8805555555555555 | 0 |
| 0.88125 | 0 |
| 0.8819444444444445 | 0 |
| 0.8826388888888889 | 0 |
| 0.8833333333333333 | 0 |
| 0.8840277777777777 | 0 |
| 0.8847222222222223 | 0 |
| 0.8854166666666666 | 0 |
| 0.8861111111111111 | 0 |
| 0.8868055555555556 | 0 |
| 0.8875000000000001 | 0 |
| 0.8881944444444444 | 0 |
| 0.8888888888888888 | 0 |
| 0.8895833333333334 | 0 |
| 0.8902777777777778 | 0 |
| 0.8909722222222222 | 0 |
| 0.8916666666666666 | 0 |
| 0.8923611111111112 | 0 |
| 0.8930555555555556 | 0 |
| 0.8937499999999999 | 0 |
| 0.8944444444444444 | 0 |
| 0.8951388888888889 | 0 |
| 0.8958333333333334 | 0 |
| 0.8965277777777777 | 0 |
| 0.8972222222222223 | 0 |
| 0.8979166666666667 | 0 |
| 0.8986111111111111 | 0 |
| 0.8993055555555555 | 0 |
| 0.9 | 0 |
| 0.9006944444444445 | 0 |
| 0.9013888888888889 | 0 |
| 0.9020833333333332 | 0 |
| 0.9027777777777778 | 0 |
| 0.9034722222222222 | 0 |
| 0.9041666666666667 | 0 |
| 0.904861111111111 | 0 |
| 0.9055555555555556 | 0 |
| 0.90625 | 0 |
| 0.9069444444444444 | 0 |
| 0.907638888888889 | 0 |
| 0.9083333333333333 | 0 |
| 0.9090277777777778 | 0 |
| 0.9097222222222222 | 0 |
| 0.9104166666666668 | 0 |
| 0.9111111111111111 | 0 |
| 0.9118055555555555 | 0 |
| 0.9125 | 0 |
| 0.9131944444444445 | 0 |
| 0.9138888888888889 | 0 |
| 0.9145833333333333 | 0 |
| 0.9152777777777777 | 0 |
| 0.9159722222222223 | 0 |
| 0.9166666666666666 | 0 |
| 0.9173611111111111 | 0 |
| 0.9180555555555556 | 0 |
| 0.9187500000000001 | 0 |
| 0.9194444444444444 | 0 |
| 0.9201388888888888 | 0 |
| 0.9208333333333334 | 0 |
| 0.9215277777777778 | 0 |
| 0.9222222222222222 | 0 |
| 0.9229166666666666 | 0 |
| 0.9236111111111112 | 0 |
| 0.9243055555555556 | 0 |
| 0.9249999999999999 | 0 |
| 0.9256944444444444 | 0 |
| 0.9263888888888889 | 0 |
| 0.9270833333333334 | 0 |
| 0.9277777777777777 | 0 |
| 0.9284722222222223 | 0 |
| 0.9291666666666667 | 0 |
| 0.9298611111111111 | 0 |
| 0.9305555555555555 | 0 |
| 0.93125 | 0 |
| 0.9319444444444445 | 0 |
| 0.9326388888888889 | 0 |
| 0.9333333333333332 | 0 |
| 0.9340277777777778 | 0 |
| 0.9347222222222222 | 0 |
| 0.9354166666666667 | 0 |
| 0.936111111111111 | 0 |
| 0.9368055555555556 | 0 |
| 0.9375 | 0 |
| 0.9381944444444444 | 0 |
| 0.938888888888889 | 0 |
| 0.9395833333333333 | 0 |
| 0.9402777777777778 | 0 |
| 0.9409722222222222 | 0 |
| 0.9416666666666668 | 0 |
| 0.9423611111111111 | 0 |
| 0.9430555555555555 | 0 |
| 0.94375 | 0 |
| 0.9444444444444445 | 0 |
| 0.9451388888888889 | 0 |
| 0.9458333333333333 | 0 |
| 0.9465277777777777 | 0 |
| 0.9472222222222223 | 0 |
| 0.9479166666666666 | 0 |
| 0.9486111111111111 | 0 |
| 0.9493055555555556 | 0 |
| 0.9500000000000001 | 0 |
| 0.9506944444444444 | 0 |
| 0.9513888888888888 | 0 |
| 0.9520833333333334 | 0 |
| 0.9527777777777778 | 0 |
| 0.9534722222222222 | 0 |
| 0.9541666666666666 | 0 |
| 0.9548611111111112 | 0 |
| 0.9555555555555556 | 0 |
| 0.9562499999999999 | 0 |
| 0.9569444444444444 | 0 |
| 0.9576388888888889 | 0 |
| 0.9583333333333334 | 0 |
| 0.9590277777777777 | 0 |
| 0.9597222222222223 | 0 |
| 0.9604166666666667 | 0 |
| 0.9611111111111111 | 0 |
| 0.9618055555555555 | 0 |
| 0.9625 | 0 |
| 0.9631944444444445 | 0 |
| 0.9638888888888889 | 0 |
| 0.9645833333333332 | 0 |
| 0.9652777777777778 | 0 |
| 0.9659722222222222 | 0 |
| 0.9666666666666667 | 0 |
| 0.967361111111111 | 0 |
| 0.9680555555555556 | 0 |
| 0.96875 | 0 |
| 0.9694444444444444 | 0 |
| 0.970138888888889 | 0 |
| 0.9708333333333333 | 0 |
| 0.9715277777777778 | 0 |
| 0.9722222222222222 | 0 |
| 0.9729166666666668 | 0 |
| 0.9736111111111111 | 0 |
| 0.9743055555555555 | 0 |
| 0.975 | 0 |
| 0.9756944444444445 | 0 |
| 0.9763888888888889 | 0 |
| 0.9770833333333333 | 0 |
| 0.9777777777777777 | 0 |
| 0.9784722222222223 | 0 |
| 0.9791666666666666 | 0 |
| 0.9798611111111111 | 0 |
| 0.9805555555555556 | 0 |
| 0.9812500000000001 | 0 |
| 0.9819444444444444 | 0 |
| 0.9826388888888888 | 0 |
| 0.9833333333333334 | 0 |
| 0.9840277777777778 | 0 |
| 0.9847222222222222 | 0 |
| 0.9854166666666666 | 0 |
| 0.9861111111111112 | 0 |
| 0.9868055555555556 | 0 |
| 0.9874999999999999 | 0 |
| 0.9881944444444444 | 0 |
| 0.9888888888888889 | 0 |
| 0.9895833333333334 | 0 |
| 0.9902777777777777 | 0 |
| 0.9909722222222223 | 0 |
| 0.9916666666666667 | 0 |
| 0.9923611111111111 | 0 |
| 0.9930555555555555 | 0 |
| 0.99375 | 0 |
| 0.9944444444444445 | 0 |
| 0.9951388888888889 | 0 |
| 0.9958333333333332 | 0 |
| 0.9965277777777778 | 0 |
| 0.9972222222222222 | 0 |
| 0.9979166666666667 | 0 |
| 0.998611111111111 | 0 |
| 0.9993055555555556 | 0 |